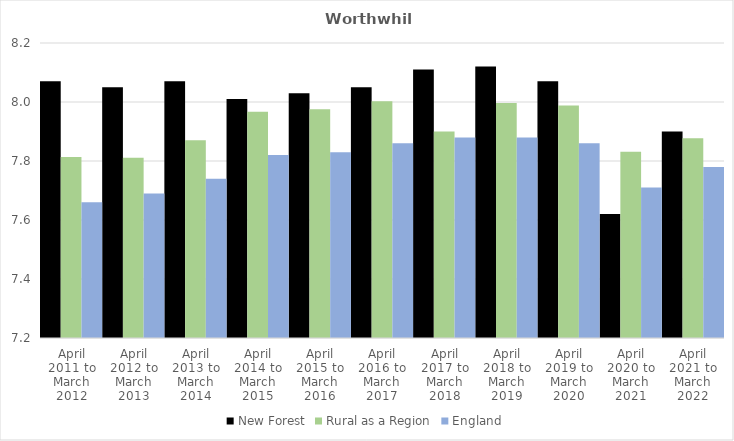
| Category | New Forest | Rural as a Region | England |
|---|---|---|---|
| April 2011 to March 2012 | 8.07 | 7.813 | 7.66 |
| April 2012 to March 2013 | 8.05 | 7.811 | 7.69 |
| April 2013 to March 2014 | 8.07 | 7.871 | 7.74 |
| April 2014 to March 2015 | 8.01 | 7.967 | 7.82 |
| April 2015 to March 2016 | 8.03 | 7.975 | 7.83 |
| April 2016 to March 2017 | 8.05 | 8.002 | 7.86 |
| April 2017 to March 2018 | 8.11 | 7.9 | 7.88 |
| April 2018 to March 2019 | 8.12 | 7.996 | 7.88 |
| April 2019 to March 2020 | 8.07 | 7.988 | 7.86 |
| April 2020 to March 2021 | 7.62 | 7.831 | 7.71 |
| April 2021 to March 2022 | 7.9 | 7.877 | 7.78 |